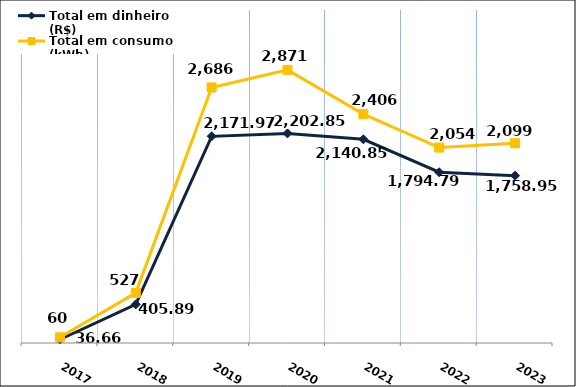
| Category | Total em dinheiro (R$) |
|---|---|
| 2017.0 | 36.66 |
| 2018.0 | 405.89 |
| 2019.0 | 2171.97 |
| 2020.0 | 2202.85 |
| 2021.0 | 2140.85 |
| 2022.0 | 1794.79 |
| 2023.0 | 1758.95 |